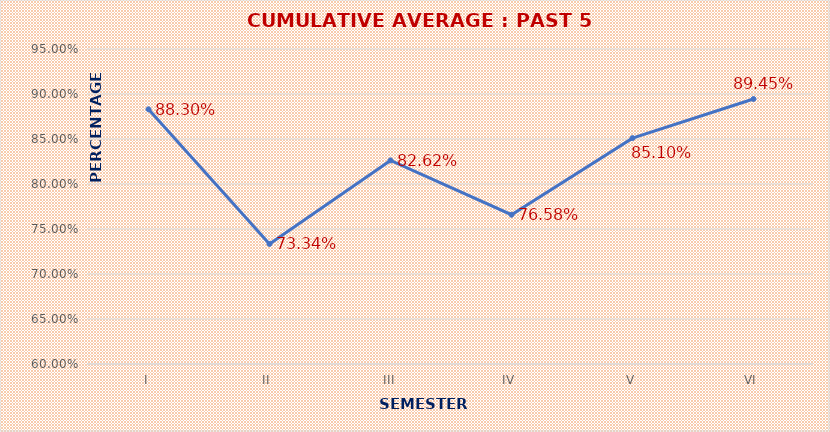
| Category | CUMULATIVE AVERAGE : PAST 5 YEARS |
|---|---|
| I | 0.883 |
| II | 0.733 |
| III | 0.826 |
| IV | 0.766 |
| V | 0.851 |
| VI | 0.894 |